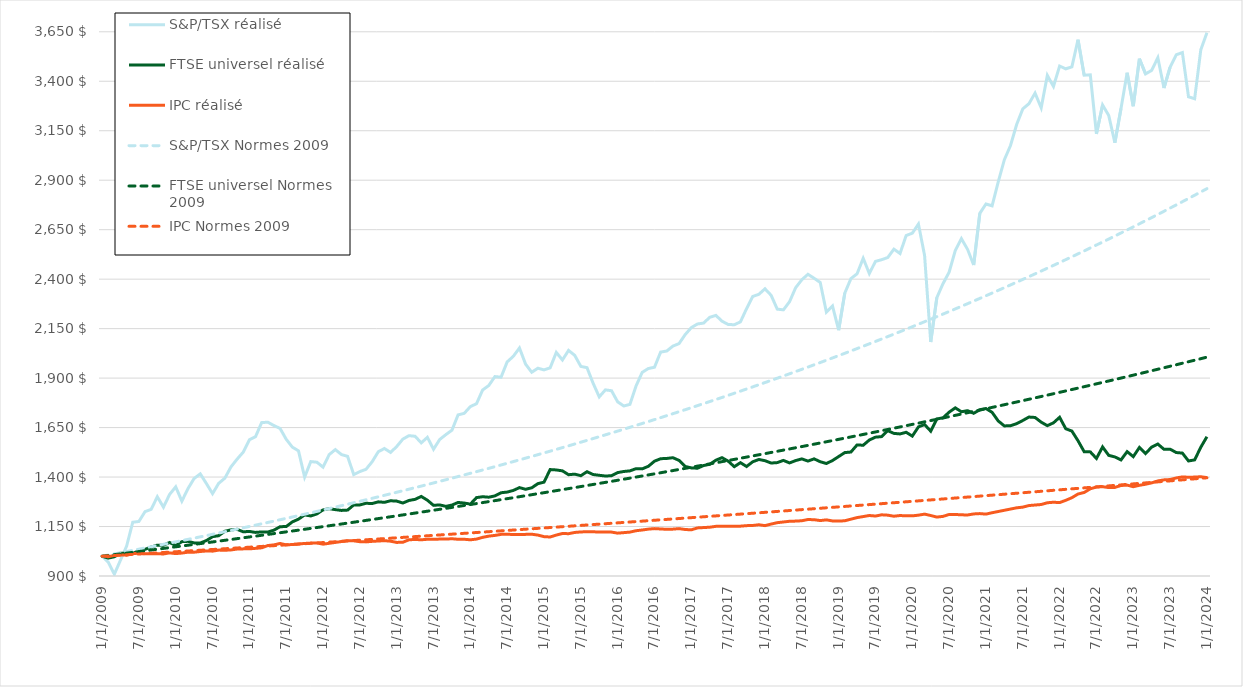
| Category | S&P/TSX réalisé | FTSE universel réalisé | IPC réalisé | S&P/TSX Normes 2009 | FTSE universel Normes 2009 | IPC Normes 2009 |
|---|---|---|---|---|---|---|
| 1/1/09 | 1000 | 1000 | 1000 | 1000 | 1000 | 1000 |
| 2/1/09 | 970.389 | 990.472 | 997.352 | 1005.85 | 1003.875 | 1001.856 |
| 3/1/09 | 909.15 | 997.266 | 1004.413 | 1011.734 | 1007.764 | 1003.715 |
| 4/1/09 | 979.96 | 1015.227 | 1006.178 | 1017.652 | 1011.669 | 1005.578 |
| 5/1/09 | 1051.114 | 1015.453 | 1005.296 | 1023.605 | 1015.589 | 1007.444 |
| 6/1/09 | 1171.605 | 1014.099 | 1012.357 | 1029.593 | 1019.524 | 1009.314 |
| 7/1/09 | 1175.638 | 1027.942 | 1015.887 | 1035.616 | 1023.474 | 1011.187 |
| 8/1/09 | 1225.223 | 1034.744 | 1012.357 | 1041.674 | 1027.44 | 1013.064 |
| 9/1/09 | 1236.826 | 1046.409 | 1012.357 | 1047.767 | 1031.421 | 1014.944 |
| 10/1/09 | 1300.415 | 1055.838 | 1012.357 | 1053.897 | 1035.418 | 1016.828 |
| 11/1/09 | 1247.834 | 1055.218 | 1011.474 | 1060.062 | 1039.429 | 1018.715 |
| 12/1/09 | 1312.158 | 1069.3 | 1016.77 | 1066.263 | 1043.457 | 1020.606 |
| 1/1/10 | 1350.55 | 1054.103 | 1013.239 | 1072.5 | 1047.5 | 1022.5 |
| 2/1/10 | 1278.324 | 1073.523 | 1015.887 | 1078.774 | 1051.559 | 1024.398 |
| 3/1/10 | 1341.895 | 1075.166 | 1020.3 | 1085.084 | 1055.633 | 1026.299 |
| 4/1/10 | 1392.993 | 1067.358 | 1020.3 | 1091.432 | 1059.723 | 1028.204 |
| 5/1/10 | 1416.196 | 1066.704 | 1023.831 | 1097.816 | 1063.83 | 1030.112 |
| 6/1/10 | 1366.937 | 1079.247 | 1026.478 | 1104.238 | 1067.952 | 1032.024 |
| 7/1/10 | 1316.175 | 1098.634 | 1025.596 | 1110.698 | 1072.09 | 1033.939 |
| 8/1/10 | 1368.282 | 1103.722 | 1030.891 | 1117.195 | 1076.244 | 1035.858 |
| 9/1/10 | 1394.237 | 1125.929 | 1030.009 | 1123.73 | 1080.414 | 1037.781 |
| 10/1/10 | 1451.235 | 1133.263 | 1031.774 | 1130.304 | 1084.6 | 1039.707 |
| 11/1/10 | 1490.571 | 1135.796 | 1036.187 | 1136.916 | 1088.802 | 1041.636 |
| 12/1/10 | 1525.903 | 1123.379 | 1037.07 | 1143.567 | 1093.021 | 1043.569 |
| 1/1/11 | 1588.325 | 1125.195 | 1037.07 | 1150.256 | 1097.256 | 1045.506 |
| 2/1/11 | 1603.988 | 1120.233 | 1039.718 | 1156.985 | 1101.508 | 1047.447 |
| 3/1/11 | 1675.155 | 1122.807 | 1042.365 | 1163.753 | 1105.776 | 1049.391 |
| 4/1/11 | 1677.242 | 1122.121 | 1053.839 | 1170.561 | 1110.06 | 1051.338 |
| 5/1/11 | 1660.106 | 1131.702 | 1057.37 | 1177.408 | 1114.361 | 1053.289 |
| 6/1/11 | 1645.706 | 1149.176 | 1064.431 | 1184.296 | 1118.679 | 1055.244 |
| 7/1/11 | 1590.9 | 1149.934 | 1057.37 | 1191.223 | 1123.014 | 1057.203 |
| 8/1/11 | 1551.154 | 1173.429 | 1059.135 | 1198.192 | 1127.365 | 1059.165 |
| 9/1/11 | 1532.403 | 1187.243 | 1061.783 | 1205.201 | 1131.733 | 1061.131 |
| 10/1/11 | 1399.676 | 1208.765 | 1064.431 | 1212.251 | 1136.118 | 1063.1 |
| 11/1/11 | 1478.156 | 1203.545 | 1066.196 | 1219.342 | 1140.52 | 1065.073 |
| 12/1/11 | 1475.034 | 1213.612 | 1067.079 | 1226.475 | 1144.94 | 1067.05 |
| 1/1/12 | 1449.973 | 1234.047 | 1060.9 | 1233.65 | 1149.376 | 1069.03 |
| 2/1/12 | 1513.379 | 1240.31 | 1065.313 | 1240.866 | 1153.829 | 1071.014 |
| 3/1/12 | 1538.704 | 1235.363 | 1069.726 | 1248.125 | 1158.3 | 1073.002 |
| 4/1/12 | 1513.622 | 1231.43 | 1074.139 | 1255.426 | 1162.788 | 1074.993 |
| 5/1/12 | 1504.596 | 1233.003 | 1078.553 | 1262.77 | 1167.294 | 1076.988 |
| 6/1/12 | 1412.214 | 1259 | 1077.67 | 1270.157 | 1171.816 | 1078.987 |
| 7/1/12 | 1427.763 | 1259.129 | 1073.257 | 1277.587 | 1176.357 | 1080.99 |
| 8/1/12 | 1439.188 | 1267.466 | 1072.374 | 1285.061 | 1180.915 | 1082.996 |
| 9/1/12 | 1477.294 | 1266.165 | 1075.022 | 1292.578 | 1185.491 | 1085.006 |
| 10/1/12 | 1527.962 | 1274.688 | 1076.787 | 1300.139 | 1190.084 | 1087.02 |
| 11/1/12 | 1544.286 | 1272.271 | 1078.553 | 1307.745 | 1194.695 | 1089.037 |
| 12/1/12 | 1524.486 | 1280.179 | 1075.905 | 1315.395 | 1199.324 | 1091.058 |
| 1/1/13 | 1554.195 | 1278.477 | 1069.726 | 1323.089 | 1203.971 | 1093.083 |
| 2/1/13 | 1591.657 | 1268.796 | 1070.609 | 1330.829 | 1208.636 | 1095.112 |
| 3/1/13 | 1609.15 | 1281.666 | 1082.966 | 1338.614 | 1213.319 | 1097.144 |
| 4/1/13 | 1606.052 | 1287.343 | 1084.731 | 1346.445 | 1218.021 | 1099.181 |
| 5/1/13 | 1572.791 | 1302.043 | 1082.966 | 1354.321 | 1222.74 | 1101.221 |
| 6/1/13 | 1600.631 | 1282.996 | 1085.613 | 1362.244 | 1227.478 | 1103.265 |
| 7/1/13 | 1540.502 | 1256.998 | 1085.613 | 1370.212 | 1232.234 | 1105.312 |
| 8/1/13 | 1589.598 | 1259.358 | 1086.496 | 1378.228 | 1237.008 | 1107.363 |
| 9/1/13 | 1614.21 | 1251.865 | 1086.496 | 1386.29 | 1241.801 | 1109.419 |
| 10/1/13 | 1636.779 | 1258.414 | 1088.261 | 1394.399 | 1246.613 | 1111.478 |
| 11/1/13 | 1714.103 | 1271.642 | 1085.613 | 1402.556 | 1251.443 | 1113.541 |
| 12/1/13 | 1721.861 | 1268.639 | 1085.613 | 1410.761 | 1256.292 | 1115.607 |
| 1/1/14 | 1756.114 | 1263.219 | 1082.966 | 1419.013 | 1261.16 | 1117.678 |
| 2/1/14 | 1770.448 | 1296.109 | 1086.496 | 1427.314 | 1266.047 | 1119.752 |
| 3/1/14 | 1839.96 | 1300.642 | 1095.322 | 1435.664 | 1270.952 | 1121.83 |
| 4/1/14 | 1862.552 | 1298.168 | 1101.5 | 1444.062 | 1275.877 | 1123.912 |
| 5/1/14 | 1907.701 | 1304.746 | 1105.031 | 1452.509 | 1280.82 | 1125.998 |
| 6/1/14 | 1904.562 | 1320.719 | 1110.327 | 1461.006 | 1285.783 | 1128.088 |
| 7/1/14 | 1982.003 | 1324.065 | 1111.209 | 1469.553 | 1290.765 | 1130.182 |
| 8/1/14 | 2010.162 | 1332.417 | 1109.444 | 1478.149 | 1295.766 | 1132.279 |
| 9/1/14 | 2052.135 | 1346.631 | 1109.444 | 1486.796 | 1300.787 | 1134.381 |
| 10/1/14 | 1970.33 | 1338.151 | 1110.327 | 1495.493 | 1305.827 | 1136.486 |
| 11/1/14 | 1929.571 | 1345.773 | 1111.209 | 1504.242 | 1310.887 | 1138.595 |
| 12/1/14 | 1950.05 | 1366.608 | 1106.796 | 1513.041 | 1315.966 | 1140.708 |
| 1/1/15 | 1941.448 | 1374.258 | 1098.853 | 1521.892 | 1321.065 | 1142.825 |
| 2/1/15 | 1952.105 | 1437.836 | 1097.087 | 1530.795 | 1326.184 | 1144.946 |
| 3/1/15 | 2029.771 | 1435.906 | 1106.796 | 1539.749 | 1331.322 | 1147.071 |
| 4/1/15 | 1991.613 | 1431.344 | 1114.74 | 1548.756 | 1336.481 | 1149.2 |
| 5/1/15 | 2039.96 | 1411.853 | 1113.857 | 1557.816 | 1341.659 | 1151.333 |
| 6/1/15 | 2015.117 | 1414.684 | 1120.035 | 1566.929 | 1346.858 | 1153.47 |
| 7/1/15 | 1959.052 | 1406.834 | 1122.683 | 1576.095 | 1352.076 | 1155.611 |
| 8/1/15 | 1952.869 | 1427.04 | 1123.566 | 1585.315 | 1357.315 | 1157.755 |
| 9/1/15 | 1874.032 | 1412.697 | 1123.566 | 1594.589 | 1362.574 | 1159.904 |
| 10/1/15 | 1805.164 | 1408.879 | 1121.801 | 1603.917 | 1367.854 | 1162.057 |
| 11/1/15 | 1840.471 | 1405.261 | 1122.683 | 1613.299 | 1373.154 | 1164.214 |
| 12/1/15 | 1836.236 | 1406.676 | 1121.801 | 1622.736 | 1378.474 | 1166.374 |
| 1/1/16 | 1779.949 | 1422.635 | 1116.505 | 1632.229 | 1383.816 | 1168.539 |
| 2/1/16 | 1759.146 | 1428.169 | 1119.153 | 1641.777 | 1389.177 | 1170.708 |
| 3/1/16 | 1767.379 | 1431.23 | 1121.801 | 1651.381 | 1394.56 | 1172.881 |
| 4/1/16 | 1860.752 | 1442.469 | 1128.861 | 1661.041 | 1399.964 | 1175.057 |
| 5/1/16 | 1929.174 | 1441.325 | 1132.392 | 1670.758 | 1405.388 | 1177.238 |
| 6/1/16 | 1948.393 | 1454.424 | 1136.805 | 1680.531 | 1410.833 | 1179.423 |
| 7/1/16 | 1955.062 | 1480.207 | 1139.453 | 1690.362 | 1416.3 | 1181.612 |
| 8/1/16 | 2031.434 | 1492.691 | 1137.688 | 1700.25 | 1421.788 | 1183.805 |
| 9/1/16 | 2036.859 | 1494.049 | 1135.922 | 1710.196 | 1427.297 | 1186.002 |
| 10/1/16 | 2061.694 | 1497.753 | 1136.805 | 1720.201 | 1432.827 | 1188.203 |
| 11/1/16 | 2074.431 | 1484.168 | 1139.453 | 1730.263 | 1438.379 | 1190.408 |
| 12/1/16 | 2119.944 | 1453.509 | 1135.04 | 1740.385 | 1443.952 | 1192.618 |
| 1/1/17 | 2155.197 | 1446.287 | 1133.274 | 1750.566 | 1449.547 | 1194.831 |
| 2/1/17 | 2173.486 | 1444.529 | 1142.983 | 1760.806 | 1455.163 | 1197.049 |
| 3/1/17 | 2178.097 | 1458.328 | 1144.748 | 1771.106 | 1460.802 | 1199.27 |
| 4/1/17 | 2207.217 | 1464.248 | 1146.514 | 1781.467 | 1466.462 | 1201.496 |
| 5/1/17 | 2216.919 | 1485.255 | 1150.927 | 1791.888 | 1472.144 | 1203.726 |
| 6/1/17 | 2187.542 | 1497.982 | 1151.809 | 1802.37 | 1477.848 | 1205.96 |
| 7/1/17 | 2171.043 | 1480.479 | 1150.927 | 1812.913 | 1483.574 | 1208.198 |
| 8/1/17 | 2169.719 | 1452.322 | 1150.927 | 1823.518 | 1489.323 | 1210.441 |
| 9/1/17 | 2184.209 | 1472.771 | 1151.809 | 1834.186 | 1495.093 | 1212.687 |
| 10/1/17 | 2251.033 | 1453.28 | 1154.457 | 1844.915 | 1500.886 | 1214.938 |
| 11/1/17 | 2312.521 | 1477.161 | 1155.34 | 1855.707 | 1506.702 | 1217.193 |
| 12/1/17 | 2323.439 | 1488.787 | 1158.87 | 1866.563 | 1512.54 | 1219.452 |
| 1/1/18 | 2351.216 | 1482.681 | 1154.457 | 1877.482 | 1518.4 | 1221.715 |
| 2/1/18 | 2318.417 | 1470.826 | 1162.401 | 1888.464 | 1524.284 | 1223.982 |
| 3/1/18 | 2248.504 | 1473 | 1169.462 | 1899.511 | 1530.19 | 1226.254 |
| 4/1/18 | 2244.952 | 1484.125 | 1172.992 | 1910.623 | 1536.119 | 1228.53 |
| 5/1/18 | 2285.838 | 1471.413 | 1176.523 | 1921.8 | 1542.071 | 1230.81 |
| 6/1/18 | 2357.046 | 1483.253 | 1177.405 | 1933.042 | 1548.046 | 1233.094 |
| 7/1/18 | 2396.96 | 1491.747 | 1179.17 | 1944.35 | 1554.044 | 1235.383 |
| 8/1/18 | 2424.525 | 1480.779 | 1185.349 | 1955.724 | 1560.065 | 1237.675 |
| 9/1/18 | 2404.643 | 1491.904 | 1184.466 | 1967.164 | 1566.11 | 1239.973 |
| 10/1/18 | 2383.256 | 1477.476 | 1180.053 | 1978.671 | 1572.178 | 1242.274 |
| 11/1/18 | 2233.725 | 1468.41 | 1183.583 | 1990.246 | 1578.27 | 1244.579 |
| 12/1/18 | 2264.666 | 1483.453 | 1178.288 | 2001.889 | 1584.385 | 1246.889 |
| 1/1/19 | 2142.281 | 1503.559 | 1177.405 | 2013.599 | 1590.524 | 1249.203 |
| 2/1/19 | 2329.416 | 1523.65 | 1179.17 | 2025.378 | 1596.687 | 1251.522 |
| 3/1/19 | 2402.749 | 1526.425 | 1187.114 | 2037.226 | 1602.874 | 1253.845 |
| 4/1/19 | 2427.096 | 1562.346 | 1195.057 | 2049.143 | 1609.084 | 1256.172 |
| 5/1/19 | 2505.267 | 1560.745 | 1200.353 | 2061.13 | 1615.319 | 1258.503 |
| 6/1/19 | 2428.506 | 1587.157 | 1205.649 | 2073.187 | 1621.578 | 1260.839 |
| 7/1/19 | 2489.836 | 1601.62 | 1203.001 | 2085.315 | 1627.861 | 1263.179 |
| 8/1/19 | 2498.382 | 1604.307 | 1209.179 | 2097.514 | 1634.168 | 1265.523 |
| 9/1/19 | 2509.235 | 1634.39 | 1207.414 | 2109.783 | 1640.5 | 1267.872 |
| 10/1/19 | 2551.598 | 1620.663 | 1202.118 | 2122.125 | 1646.857 | 1270.225 |
| 11/1/19 | 2529.664 | 1617.862 | 1205.649 | 2134.539 | 1653.238 | 1272.582 |
| 12/1/19 | 2620.47 | 1626.224 | 1203.883 | 2147.025 | 1659.644 | 1274.944 |
| 1/1/20 | 2632.371 | 1606.865 | 1203.883 | 2159.585 | 1666.074 | 1277.311 |
| 2/1/20 | 2678.29 | 1653.587 | 1207.414 | 2172.218 | 1672.53 | 1279.681 |
| 3/1/20 | 2520.229 | 1665.319 | 1212.71 | 2184.925 | 1679.01 | 1282.056 |
| 4/1/20 | 2082.306 | 1632.004 | 1205.649 | 2197.706 | 1685.516 | 1284.436 |
| 5/1/20 | 2307.031 | 1693.786 | 1197.705 | 2210.562 | 1692.047 | 1286.819 |
| 6/1/20 | 2377.152 | 1699.087 | 1201.236 | 2223.493 | 1698.603 | 1289.208 |
| 7/1/20 | 2435.698 | 1727.82 | 1210.944 | 2236.5 | 1705.184 | 1291.6 |
| 8/1/20 | 2544.89 | 1749.736 | 1210.944 | 2249.583 | 1711.792 | 1293.997 |
| 9/1/20 | 2604.656 | 1729.957 | 1209.179 | 2262.743 | 1718.424 | 1296.399 |
| 10/1/20 | 2550.957 | 1735.422 | 1208.297 | 2275.979 | 1725.083 | 1298.805 |
| 11/1/20 | 2471.514 | 1722.296 | 1213.592 | 2289.293 | 1731.767 | 1301.216 |
| 12/1/20 | 2732.699 | 1740.001 | 1215.357 | 2302.685 | 1738.477 | 1303.631 |
| 1/1/21 | 2779.789 | 1746.367 | 1212.71 | 2316.155 | 1745.213 | 1306.05 |
| 2/1/21 | 2770.828 | 1727.021 | 1219.771 | 2329.704 | 1751.975 | 1308.474 |
| 3/1/21 | 2891.766 | 1683.469 | 1225.949 | 2343.332 | 1758.763 | 1310.902 |
| 4/1/21 | 3003.633 | 1658.395 | 1232.127 | 2357.04 | 1765.578 | 1313.335 |
| 5/1/21 | 3075.412 | 1659.36 | 1238.305 | 2370.828 | 1772.419 | 1315.773 |
| 6/1/21 | 3181.308 | 1669.821 | 1244.484 | 2384.697 | 1779.287 | 1318.215 |
| 7/1/21 | 3260.255 | 1685.84 | 1248.014 | 2398.647 | 1786.181 | 1320.661 |
| 8/1/21 | 3286.445 | 1703.204 | 1255.958 | 2412.678 | 1793.102 | 1323.112 |
| 9/1/21 | 3340.109 | 1701.088 | 1258.605 | 2426.792 | 1800.049 | 1325.568 |
| 10/1/21 | 3265.807 | 1677.351 | 1261.253 | 2440.988 | 1807.024 | 1328.028 |
| 11/1/21 | 3429.605 | 1659.675 | 1270.079 | 2455.267 | 1814.026 | 1330.493 |
| 12/1/21 | 3373.991 | 1674.101 | 1272.727 | 2469.629 | 1821.054 | 1332.962 |
| 1/1/22 | 3477.264 | 1701.937 | 1270.962 | 2484.076 | 1828.11 | 1335.436 |
| 2/1/22 | 3462.951 | 1644.071 | 1282.436 | 2498.607 | 1835.194 | 1337.915 |
| 3/1/22 | 3472.645 | 1632.345 | 1295.675 | 2513.224 | 1842.305 | 1340.398 |
| 4/1/22 | 3610.012 | 1583.354 | 1314.21 | 2527.925 | 1849.443 | 1342.885 |
| 5/1/22 | 3430.886 | 1528.241 | 1322.154 | 2542.713 | 1856.609 | 1345.378 |
| 6/1/22 | 3432.843 | 1527.197 | 1340.688 | 2557.587 | 1863.803 | 1347.875 |
| 7/1/22 | 3134 | 1493.892 | 1349.515 | 2572.548 | 1871.024 | 1350.376 |
| 8/1/22 | 3279.923 | 1552.208 | 1351.28 | 2587.597 | 1878.274 | 1352.882 |
| 9/1/22 | 3227.216 | 1509.651 | 1346.867 | 2602.734 | 1885.552 | 1355.393 |
| 10/1/22 | 3089.84 | 1501.671 | 1347.749 | 2617.959 | 1892.858 | 1357.909 |
| 11/1/22 | 3261.986 | 1486.613 | 1357.458 | 2633.274 | 1900.192 | 1360.429 |
| 12/1/22 | 3442.654 | 1528.455 | 1359.223 | 2648.678 | 1907.554 | 1362.954 |
| 1/1/23 | 3274.129 | 1503.216 | 1351.28 | 2664.172 | 1914.946 | 1365.483 |
| 2/1/23 | 3514.037 | 1549.662 | 1358.341 | 2679.756 | 1922.365 | 1368.018 |
| 3/1/23 | 3437.21 | 1518.774 | 1363.636 | 2695.432 | 1929.814 | 1370.557 |
| 4/1/23 | 3455.055 | 1551.578 | 1370.697 | 2711.2 | 1937.291 | 1373.1 |
| 5/1/23 | 3518.966 | 1566.779 | 1380.406 | 2727.06 | 1944.798 | 1375.649 |
| 6/1/23 | 3365.818 | 1540.31 | 1385.702 | 2743.012 | 1952.333 | 1378.202 |
| 7/1/23 | 3470.811 | 1540.925 | 1387.467 | 2759.058 | 1959.898 | 1380.76 |
| 8/1/23 | 3533.88 | 1523.879 | 1395.41 | 2775.198 | 1967.492 | 1383.322 |
| 9/1/23 | 3544.996 | 1521.076 | 1400.706 | 2791.432 | 1975.115 | 1385.89 |
| 10/1/23 | 3321.58 | 1481.28 | 1398.941 | 2807.761 | 1982.768 | 1388.462 |
| 11/1/23 | 3311.692 | 1486.771 | 1399.823 | 2824.186 | 1990.451 | 1391.039 |
| 12/1/23 | 3558.879 | 1550.592 | 1401.589 | 2840.707 | 1998.163 | 1393.62 |
| 1/1/24 | 3645.378 | 1603.773 | 1397.176 | 2857.324 | 2005.906 | 1396.207 |